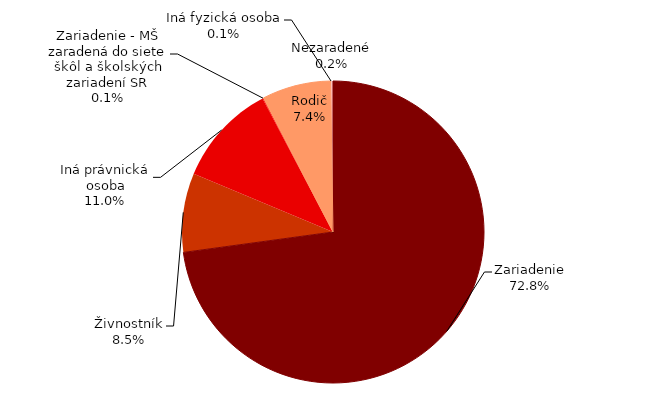
| Category | Series 0 |
|---|---|
| Zariadenie | 2467.5 |
| Živnostník | 287 |
| Iná právnická osoba | 371.417 |
| Zariadenie - MŠ zaradená do siete škôl a školských zariadení SR | 3.8 |
| Rodič | 249.25 |
| Iná fyzická osoba | 3.25 |
| Nezaradené | 5.417 |